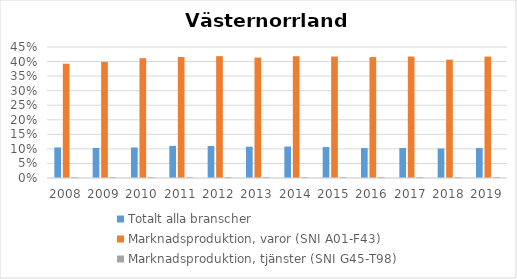
| Category | Totalt alla branscher | Marknadsproduktion, varor (SNI A01-F43) | Marknadsproduktion, tjänster (SNI G45-T98) |
|---|---|---|---|
| 2008.0 | 0.105 | 0.393 | 0.003 |
| 2009.0 | 0.103 | 0.399 | 0.003 |
| 2010.0 | 0.105 | 0.411 | 0.003 |
| 2011.0 | 0.11 | 0.416 | 0.003 |
| 2012.0 | 0.11 | 0.419 | 0.003 |
| 2013.0 | 0.108 | 0.414 | 0.003 |
| 2014.0 | 0.108 | 0.418 | 0.003 |
| 2015.0 | 0.106 | 0.417 | 0.003 |
| 2016.0 | 0.103 | 0.415 | 0.003 |
| 2017.0 | 0.103 | 0.417 | 0.003 |
| 2018.0 | 0.101 | 0.407 | 0.003 |
| 2019.0 | 0.103 | 0.417 | 0.004 |